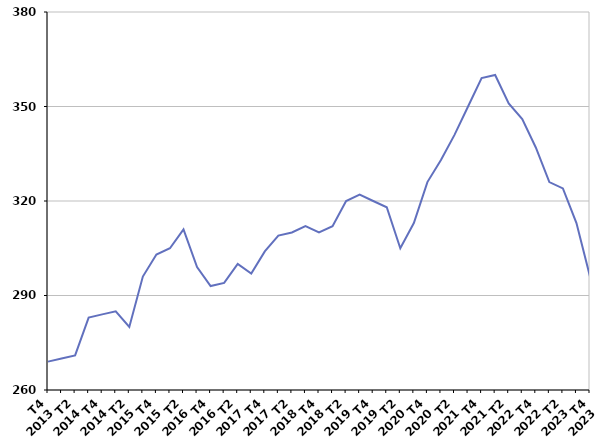
| Category | Durée moyenne d'inscription sur les listes des sortants |
|---|---|
| T4
2013 | 269 |
| T1
2014 | 270 |
| T2
2014 | 271 |
| T3
2014 | 283 |
| T4
2014 | 284 |
| T1
2015 | 285 |
| T2
2015 | 280 |
| T3
2015 | 296 |
| T4
2015 | 303 |
| T1
2016 | 305 |
| T2
2016 | 311 |
| T3
2016 | 299 |
| T4
2016 | 293 |
| T1
2017 | 294 |
| T2
2017 | 300 |
| T3
2017 | 297 |
| T4
2017 | 304 |
| T1
2018 | 309 |
| T2
2018 | 310 |
| T3
2018 | 312 |
| T4
2018 | 310 |
| T1
2019 | 312 |
| T2
2019 | 320 |
| T3
2019 | 322 |
| T4
2019 | 320 |
| T1
2020 | 318 |
| T2
2020 | 305 |
| T3
2020 | 313 |
| T4
2020 | 326 |
| T1
2021 | 333 |
| T2
2021 | 341 |
| T3
2021 | 350 |
| T4
2021 | 359 |
| T1
2022 | 360 |
| T2
2022 | 351 |
| T3
2022 | 346 |
| T4
2022 | 337 |
| T1
2023 | 326 |
| T2
2023 | 324 |
| T3
2023 | 313 |
| T4
2023 | 296 |